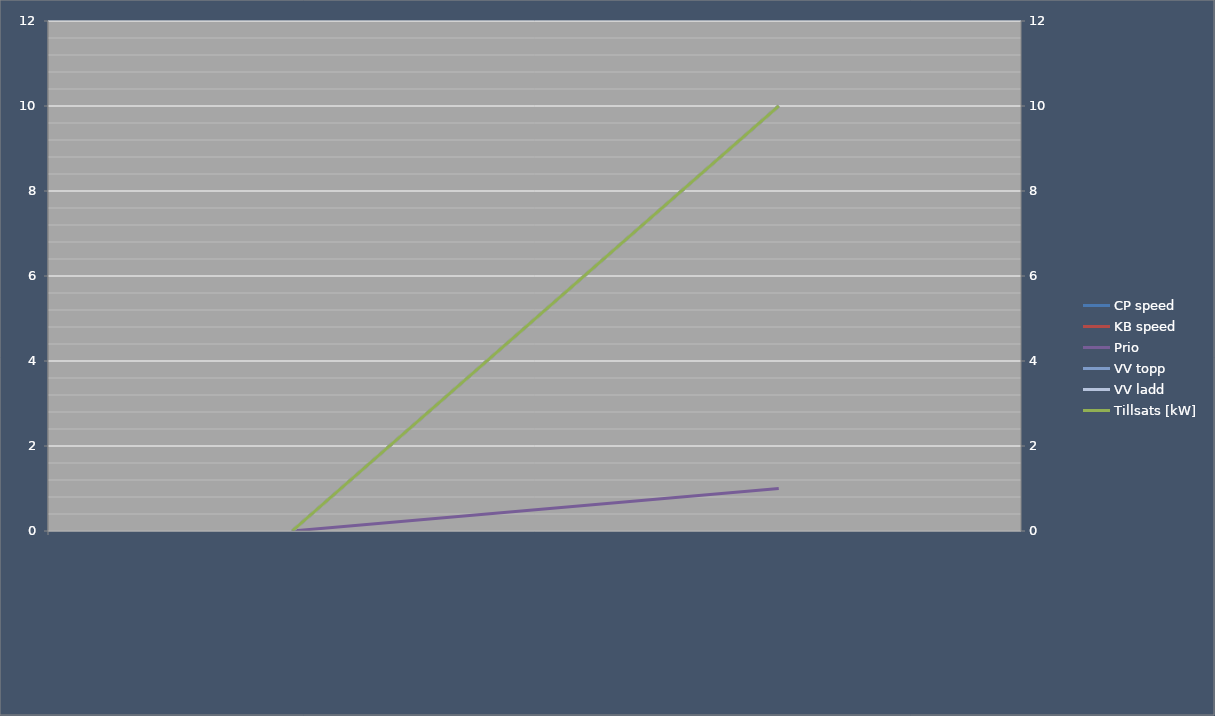
| Category | CP speed | KB speed | Prio | VV topp | VV ladd |
|---|---|---|---|---|---|
|  | 0 | 0 | 0 | 0 | 0 |
|  | 10 | 10 | 1 | 10 | 10 |